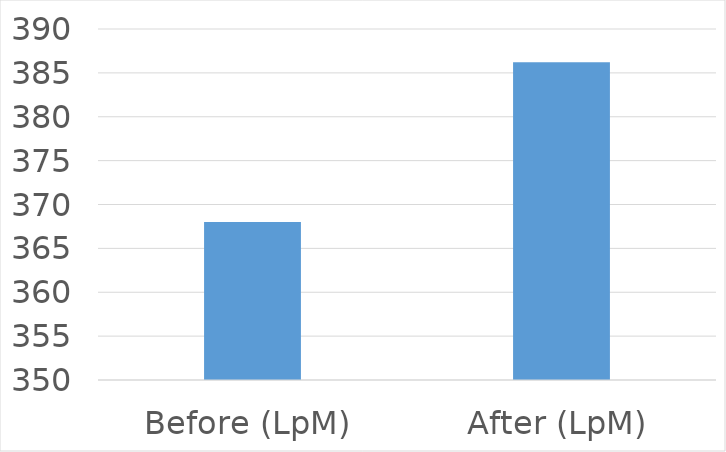
| Category | Series 0 |
|---|---|
| Before (LpM) | 368 |
| After (LpM) | 386.2 |